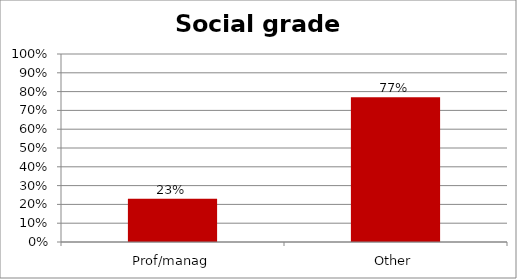
| Category | Series 0 |
|---|---|
| Prof/manag | 0.23 |
| Other | 0.77 |